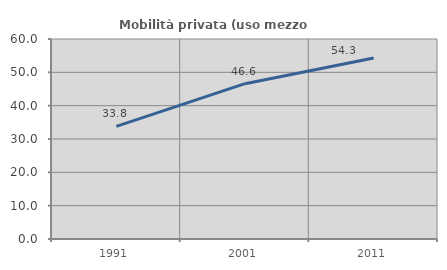
| Category | Mobilità privata (uso mezzo privato) |
|---|---|
| 1991.0 | 33.774 |
| 2001.0 | 46.593 |
| 2011.0 | 54.323 |